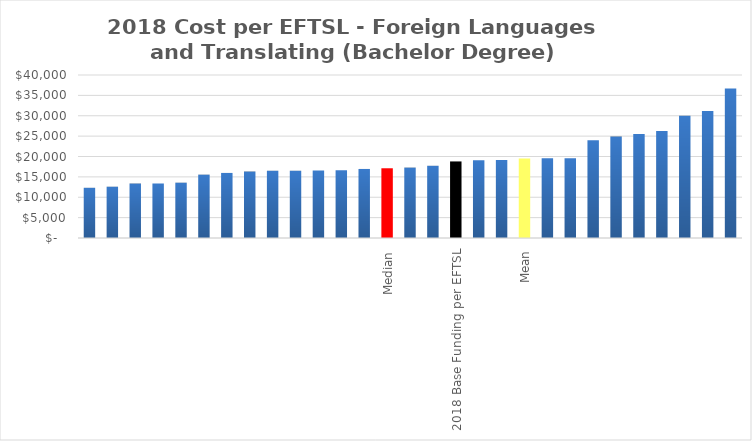
| Category | Series 0 |
|---|---|
|  | 12320.669 |
|  | 12588.057 |
|  | 13371.645 |
|  | 13376.702 |
|  | 13575.332 |
|  | 15547.787 |
|  | 15968.082 |
|  | 16317.2 |
|  | 16505.565 |
|  | 16507.385 |
|  | 16589.744 |
|  | 16598.596 |
|  | 16943.64 |
| Median | 17111.589 |
|  | 17279.537 |
|  | 17722.17 |
| 2018 Base Funding per EFTSL | 18788.296 |
|  | 19049.22 |
|  | 19144.329 |
| Mean | 19500.818 |